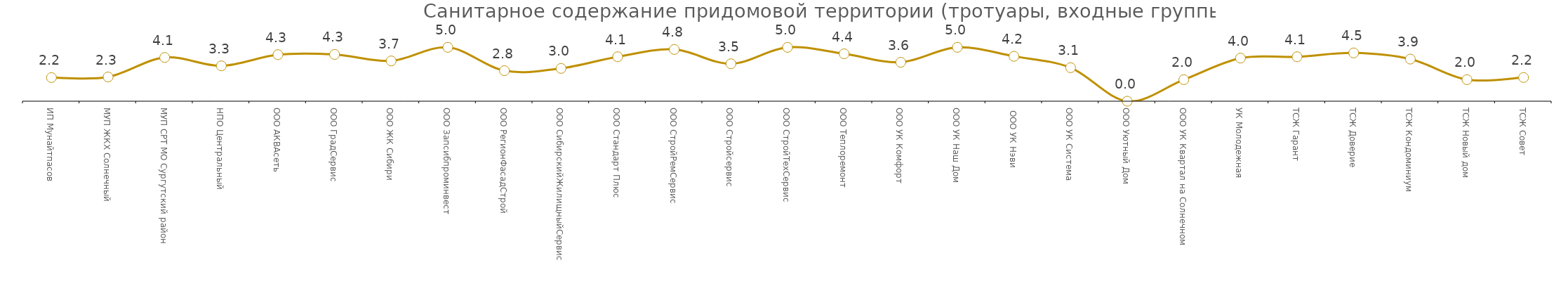
| Category |  Санитарное содержание придомовой территории (тротуары, входные группы) |
|---|---|
| ИП Мунайтпасов | 2.194 |
| МУП ЖКХ Солнечный | 2.25 |
| МУП СРТ МО Сургутский район | 4.06 |
| НПО Центральный | 3.281 |
| ООО АКВАсеть | 4.32 |
| ООО ГрадСервис | 4.34 |
| ООО ЖК Сибири | 3.74 |
| ООО Запсибпроминвест | 5 |
| ООО РегионФасадСтрой | 2.833 |
| ООО СибирскийЖилищныйСервис | 3.044 |
| ООО Стандарт Плюс | 4.125 |
| ООО СтройРемСервис | 4.804 |
| ООО Стройсервис | 3.476 |
| ООО СтройТехСервис | 5 |
| ООО Теплоремонт | 4.4 |
| ООО УК Комфорт | 3.615 |
| ООО УК Наш Дом | 5 |
|  ООО УК Нэви | 4.167 |
| ООО УК Система | 3.111 |
| ООО Уютный Дом | 0 |
| ООО УК Квартал на Солнечном | 2 |
| УК Молодежная | 4 |
| ТСЖ Гарант | 4.125 |
| ТСЖ Доверие | 4.481 |
| ТСЖ Кондоминиум | 3.909 |
| ТСЖ Новый дом | 2 |
| ТСЖ Совет | 2.2 |